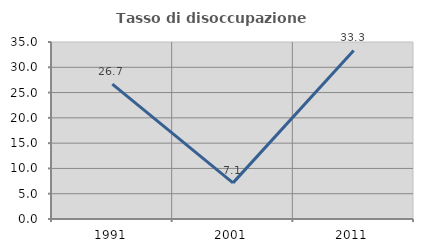
| Category | Tasso di disoccupazione giovanile  |
|---|---|
| 1991.0 | 26.667 |
| 2001.0 | 7.143 |
| 2011.0 | 33.333 |